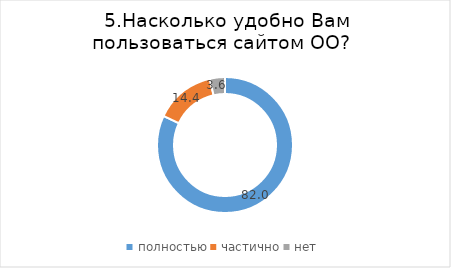
| Category | Series 0 |
|---|---|
| полностью | 82.026 |
| частично | 14.379 |
| нет | 3.595 |